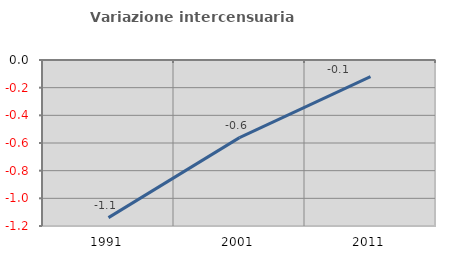
| Category | Variazione intercensuaria annua |
|---|---|
| 1991.0 | -1.14 |
| 2001.0 | -0.561 |
| 2011.0 | -0.12 |